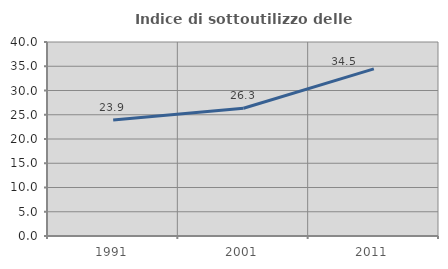
| Category | Indice di sottoutilizzo delle abitazioni  |
|---|---|
| 1991.0 | 23.929 |
| 2001.0 | 26.346 |
| 2011.0 | 34.462 |